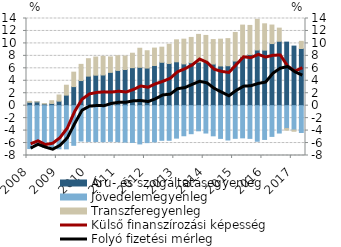
| Category | Áru- és szolgáltatásegyenleg | Jövedelemegyenleg | Transzferegyenleg |
|---|---|---|---|
| 2008.0 | 0.545 | -6.887 | 0.144 |
| 2008.0 | 0.61 | -6.347 | 0.016 |
| 2008.0 | 0.277 | -6.657 | 0.057 |
| 2008.0 | 0.358 | -6.905 | 0.436 |
| 2009.0 | 0.728 | -6.927 | 0.987 |
| 2009.0 | 1.697 | -6.933 | 1.589 |
| 2009.0 | 3.066 | -6.363 | 2.317 |
| 2009.0 | 4.037 | -5.676 | 2.596 |
| 2010.0 | 4.746 | -5.736 | 2.798 |
| 2010.0 | 4.899 | -5.762 | 2.911 |
| 2010.0 | 4.931 | -5.782 | 2.992 |
| 2010.0 | 5.35 | -5.725 | 2.481 |
| 2011.0 | 5.661 | -5.779 | 2.365 |
| 2011.0 | 5.81 | -5.851 | 2.156 |
| 2011.0 | 6.104 | -5.902 | 2.32 |
| 2011.0 | 6.163 | -6.14 | 3.059 |
| 2012.0 | 6.044 | -5.934 | 2.777 |
| 2012.0 | 6.452 | -5.814 | 2.795 |
| 2012.0 | 6.968 | -5.561 | 2.427 |
| 2012.0 | 6.782 | -5.556 | 3.082 |
| 2013.0 | 7.049 | -5.208 | 3.526 |
| 2013.0 | 6.711 | -4.831 | 3.971 |
| 2013.0 | 6.903 | -4.499 | 4.057 |
| 2013.0 | 6.992 | -4.037 | 4.457 |
| 2014.0 | 7.069 | -4.392 | 4.211 |
| 2014.0 | 6.684 | -4.841 | 3.935 |
| 2014.0 | 6.384 | -5.253 | 4.295 |
| 2014.0 | 6.414 | -5.509 | 4.354 |
| 2015.0 | 7.172 | -5.243 | 4.586 |
| 2015.0 | 7.857 | -5.167 | 5.084 |
| 2015.0 | 8.224 | -5.252 | 4.664 |
| 2015.0 | 8.941 | -5.711 | 4.927 |
| 2016.0 | 8.922 | -5.422 | 4.226 |
| 2016.0 | 9.974 | -4.931 | 2.975 |
| 2016.0 | 10.343 | -4.395 | 2.111 |
| 2016.0 | 10.206 | -3.672 | -0.261 |
| 2017.0 | 9.569 | -3.913 | -0.195 |
| 2017.0 | 9.184 | -4.303 | 1.148 |